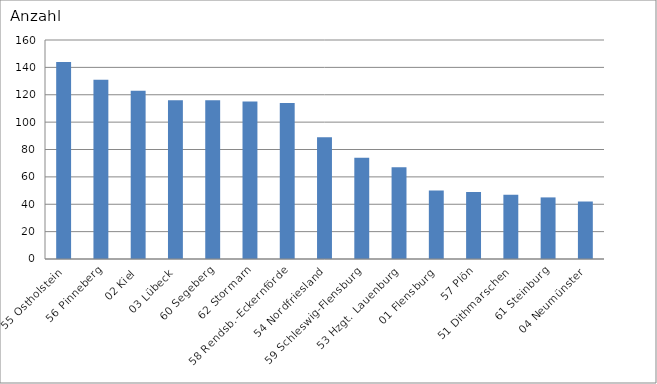
| Category | 55 Ostholstein 56 Pinneberg 02 Kiel 03 Lübeck 60 Segeberg 62 Stormarn 58 Rendsb.-Eckernförde 54 Nordfriesland 59 Schleswig-Flensburg 53 Hzgt. Lauenburg 01 Flensburg 57 Plön 51 Dithmarschen 61 Steinburg 04 Neumünster |
|---|---|
| 55 Ostholstein | 144 |
| 56 Pinneberg | 131 |
| 02 Kiel | 123 |
| 03 Lübeck | 116 |
| 60 Segeberg | 116 |
| 62 Stormarn | 115 |
| 58 Rendsb.-Eckernförde | 114 |
| 54 Nordfriesland | 89 |
| 59 Schleswig-Flensburg | 74 |
| 53 Hzgt. Lauenburg | 67 |
| 01 Flensburg | 50 |
| 57 Plön | 49 |
| 51 Dithmarschen | 47 |
| 61 Steinburg | 45 |
| 04 Neumünster | 42 |